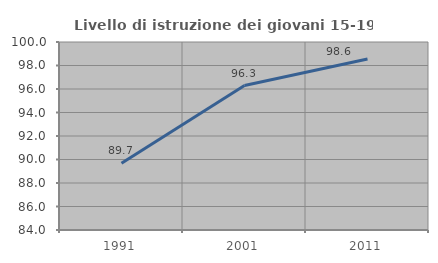
| Category | Livello di istruzione dei giovani 15-19 anni |
|---|---|
| 1991.0 | 89.677 |
| 2001.0 | 96.296 |
| 2011.0 | 98.556 |